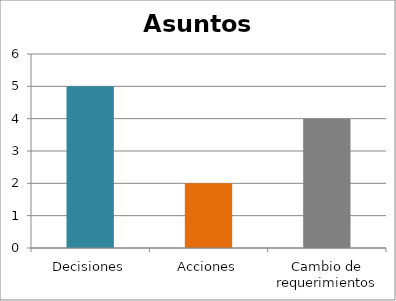
| Category | Series 0 |
|---|---|
| Decisiones | 5 |
| Acciones | 2 |
| Cambio de requerimientos | 4 |